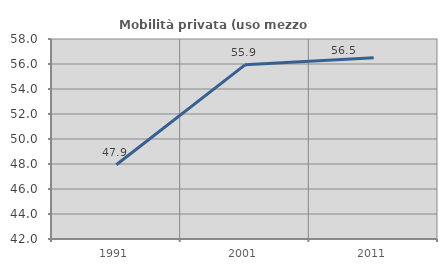
| Category | Mobilità privata (uso mezzo privato) |
|---|---|
| 1991.0 | 47.94 |
| 2001.0 | 55.933 |
| 2011.0 | 56.506 |